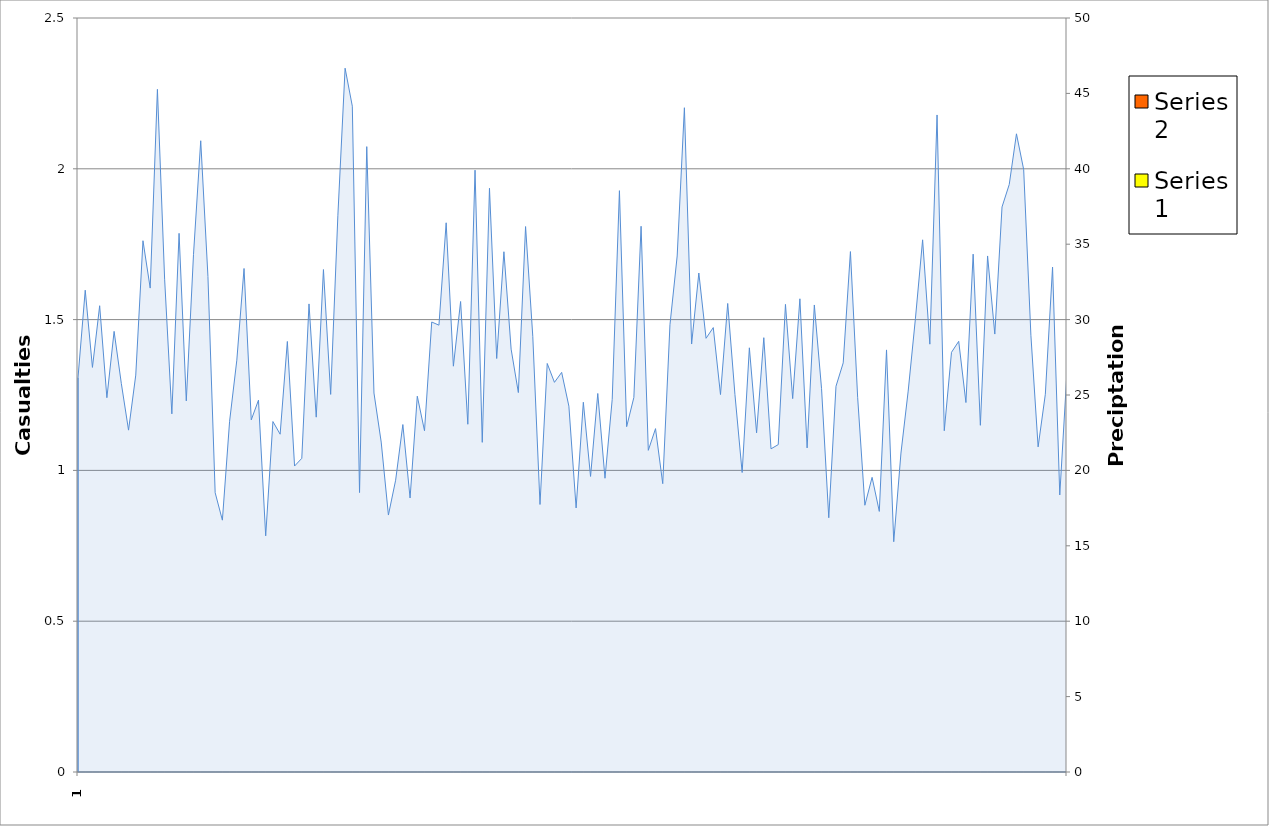
| Category | Series 2 | Series 3 |
|---|---|---|
| 0 | 1 | 1 |